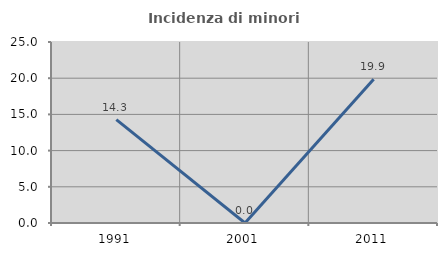
| Category | Incidenza di minori stranieri |
|---|---|
| 1991.0 | 14.286 |
| 2001.0 | 0 |
| 2011.0 | 19.853 |